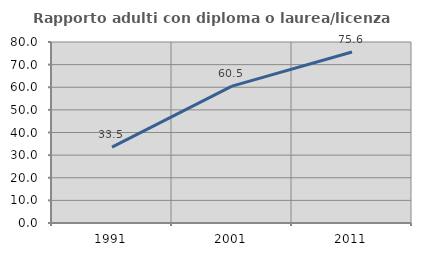
| Category | Rapporto adulti con diploma o laurea/licenza media  |
|---|---|
| 1991.0 | 33.54 |
| 2001.0 | 60.494 |
| 2011.0 | 75.604 |